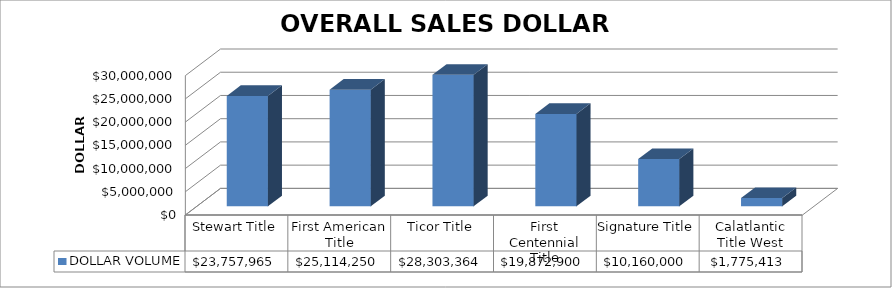
| Category | DOLLAR VOLUME |
|---|---|
| Stewart Title | 23757965 |
| First American Title | 25114250 |
| Ticor Title | 28303364.05 |
| First Centennial Title | 19872900 |
| Signature Title | 10160000 |
| Calatlantic Title West | 1775413 |